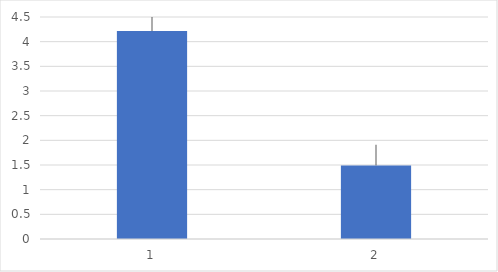
| Category | Series 0 |
|---|---|
| 0 | 4.214 |
| 1 | 1.492 |